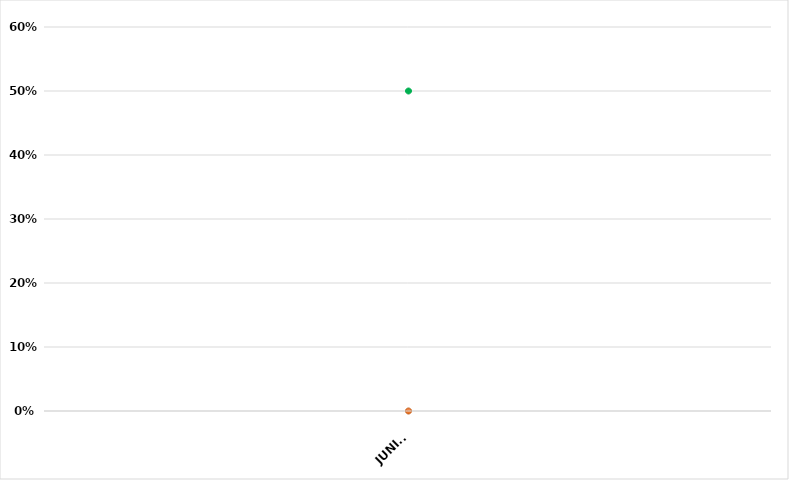
| Category | VALOR  | META PONDERADA |
|---|---|---|
| JUNIO | 0 | 0.5 |